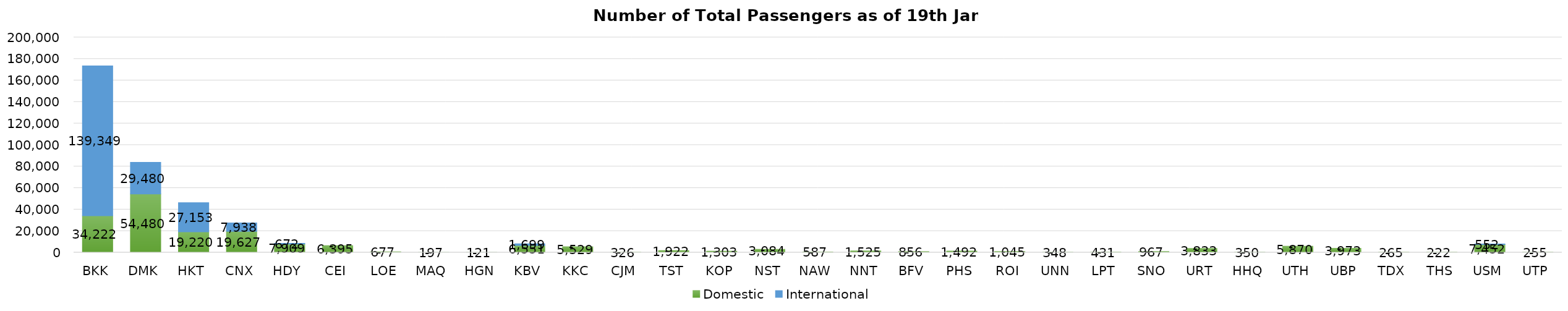
| Category | Domestic | International |
|---|---|---|
| BKK | 34222 | 139349 |
| DMK | 54480 | 29480 |
| HKT | 19220 | 27153 |
| CNX | 19627 | 7938 |
| HDY | 7909 | 672 |
| CEI | 6395 | 0 |
| LOE | 677 | 0 |
| MAQ | 197 | 0 |
| HGN | 121 | 0 |
| KBV | 6551 | 1699 |
| KKC | 5529 | 0 |
| CJM | 326 | 0 |
| TST | 1922 | 0 |
| KOP | 1303 | 0 |
| NST | 3084 | 0 |
| NAW | 587 | 0 |
| NNT | 1525 | 0 |
| BFV | 856 | 0 |
| PHS | 1492 | 0 |
| ROI | 1045 | 0 |
| UNN | 348 | 0 |
| LPT | 431 | 0 |
| SNO | 967 | 0 |
| URT | 3833 | 0 |
| HHQ | 350 | 0 |
| UTH | 5870 | 0 |
| UBP | 3973 | 0 |
| TDX | 265 | 0 |
| THS | 222 | 0 |
| USM | 7452 | 552 |
| UTP | 255 | 0 |